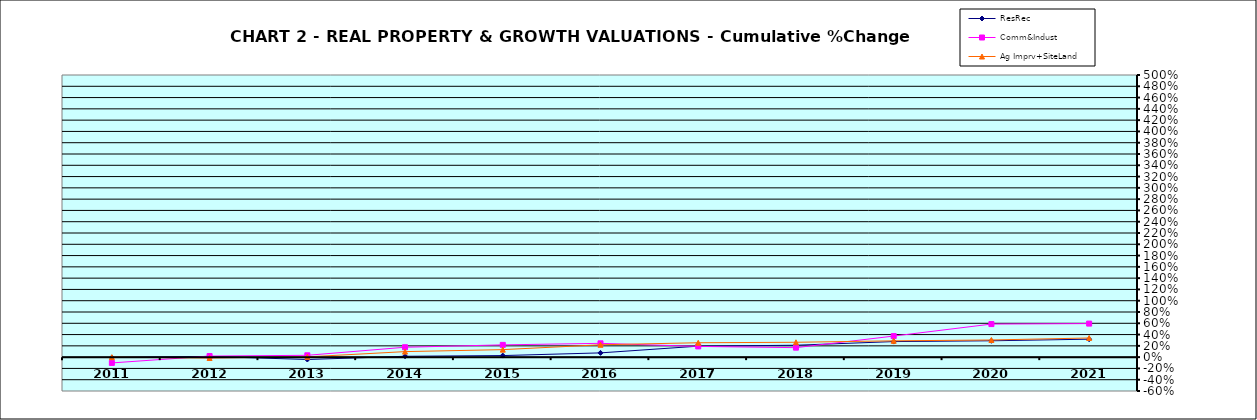
| Category | ResRec | Comm&Indust | Ag Imprv+SiteLand |
|---|---|---|---|
| 2011.0 | -0.007 | -0.103 | 0 |
| 2012.0 | 0.013 | 0.019 | -0.015 |
| 2013.0 | -0.042 | 0.033 | 0.005 |
| 2014.0 | 0.016 | 0.175 | 0.098 |
| 2015.0 | 0.028 | 0.218 | 0.133 |
| 2016.0 | 0.075 | 0.245 | 0.219 |
| 2017.0 | 0.195 | 0.19 | 0.255 |
| 2018.0 | 0.211 | 0.168 | 0.263 |
| 2019.0 | 0.276 | 0.373 | 0.289 |
| 2020.0 | 0.29 | 0.586 | 0.304 |
| 2021.0 | 0.318 | 0.594 | 0.339 |